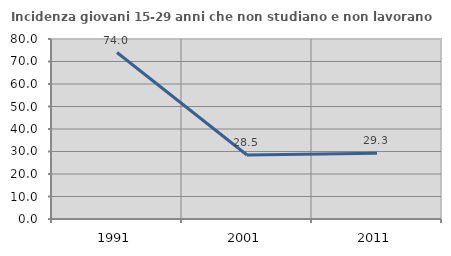
| Category | Incidenza giovani 15-29 anni che non studiano e non lavorano  |
|---|---|
| 1991.0 | 73.988 |
| 2001.0 | 28.467 |
| 2011.0 | 29.268 |